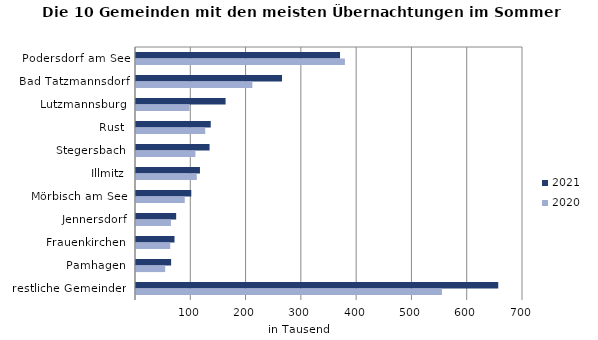
| Category | 2021 | 2020 |
|---|---|---|
| Podersdorf am See | 369042 | 377861 |
| Bad Tatzmannsdorf | 264125 | 210485 |
| Lutzmannsburg | 162032 | 96787 |
| Rust | 135204 | 125212 |
| Stegersbach | 133057 | 107466 |
| Illmitz | 115665 | 109970 |
| Mörbisch am See | 100016 | 88224 |
| Jennersdorf | 72657 | 63201 |
| Frauenkirchen | 69645 | 61923 |
| Pamhagen | 63530 | 52791 |
| restliche Gemeinden | 655223 | 553413 |